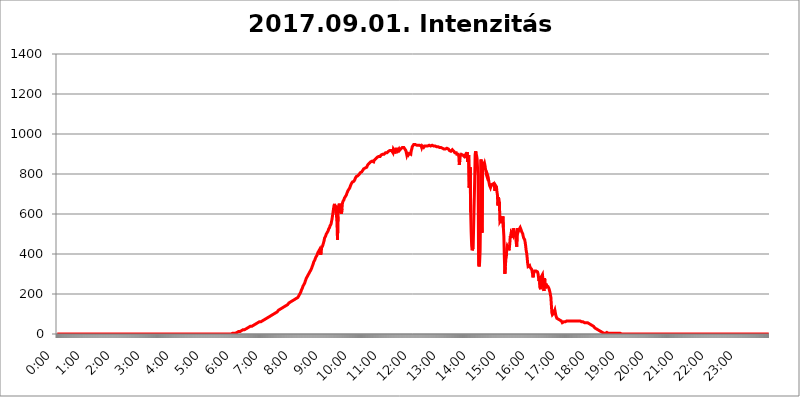
| Category | 2017.09.01. Intenzitás [W/m^2] |
|---|---|
| 0.0 | 0 |
| 0.0006944444444444445 | 0 |
| 0.001388888888888889 | 0 |
| 0.0020833333333333333 | 0 |
| 0.002777777777777778 | 0 |
| 0.003472222222222222 | 0 |
| 0.004166666666666667 | 0 |
| 0.004861111111111111 | 0 |
| 0.005555555555555556 | 0 |
| 0.0062499999999999995 | 0 |
| 0.006944444444444444 | 0 |
| 0.007638888888888889 | 0 |
| 0.008333333333333333 | 0 |
| 0.009027777777777779 | 0 |
| 0.009722222222222222 | 0 |
| 0.010416666666666666 | 0 |
| 0.011111111111111112 | 0 |
| 0.011805555555555555 | 0 |
| 0.012499999999999999 | 0 |
| 0.013194444444444444 | 0 |
| 0.013888888888888888 | 0 |
| 0.014583333333333332 | 0 |
| 0.015277777777777777 | 0 |
| 0.015972222222222224 | 0 |
| 0.016666666666666666 | 0 |
| 0.017361111111111112 | 0 |
| 0.018055555555555557 | 0 |
| 0.01875 | 0 |
| 0.019444444444444445 | 0 |
| 0.02013888888888889 | 0 |
| 0.020833333333333332 | 0 |
| 0.02152777777777778 | 0 |
| 0.022222222222222223 | 0 |
| 0.02291666666666667 | 0 |
| 0.02361111111111111 | 0 |
| 0.024305555555555556 | 0 |
| 0.024999999999999998 | 0 |
| 0.025694444444444447 | 0 |
| 0.02638888888888889 | 0 |
| 0.027083333333333334 | 0 |
| 0.027777777777777776 | 0 |
| 0.02847222222222222 | 0 |
| 0.029166666666666664 | 0 |
| 0.029861111111111113 | 0 |
| 0.030555555555555555 | 0 |
| 0.03125 | 0 |
| 0.03194444444444445 | 0 |
| 0.03263888888888889 | 0 |
| 0.03333333333333333 | 0 |
| 0.034027777777777775 | 0 |
| 0.034722222222222224 | 0 |
| 0.035416666666666666 | 0 |
| 0.036111111111111115 | 0 |
| 0.03680555555555556 | 0 |
| 0.0375 | 0 |
| 0.03819444444444444 | 0 |
| 0.03888888888888889 | 0 |
| 0.03958333333333333 | 0 |
| 0.04027777777777778 | 0 |
| 0.04097222222222222 | 0 |
| 0.041666666666666664 | 0 |
| 0.042361111111111106 | 0 |
| 0.04305555555555556 | 0 |
| 0.043750000000000004 | 0 |
| 0.044444444444444446 | 0 |
| 0.04513888888888889 | 0 |
| 0.04583333333333334 | 0 |
| 0.04652777777777778 | 0 |
| 0.04722222222222222 | 0 |
| 0.04791666666666666 | 0 |
| 0.04861111111111111 | 0 |
| 0.049305555555555554 | 0 |
| 0.049999999999999996 | 0 |
| 0.05069444444444445 | 0 |
| 0.051388888888888894 | 0 |
| 0.052083333333333336 | 0 |
| 0.05277777777777778 | 0 |
| 0.05347222222222222 | 0 |
| 0.05416666666666667 | 0 |
| 0.05486111111111111 | 0 |
| 0.05555555555555555 | 0 |
| 0.05625 | 0 |
| 0.05694444444444444 | 0 |
| 0.057638888888888885 | 0 |
| 0.05833333333333333 | 0 |
| 0.05902777777777778 | 0 |
| 0.059722222222222225 | 0 |
| 0.06041666666666667 | 0 |
| 0.061111111111111116 | 0 |
| 0.06180555555555556 | 0 |
| 0.0625 | 0 |
| 0.06319444444444444 | 0 |
| 0.06388888888888888 | 0 |
| 0.06458333333333334 | 0 |
| 0.06527777777777778 | 0 |
| 0.06597222222222222 | 0 |
| 0.06666666666666667 | 0 |
| 0.06736111111111111 | 0 |
| 0.06805555555555555 | 0 |
| 0.06874999999999999 | 0 |
| 0.06944444444444443 | 0 |
| 0.07013888888888889 | 0 |
| 0.07083333333333333 | 0 |
| 0.07152777777777779 | 0 |
| 0.07222222222222223 | 0 |
| 0.07291666666666667 | 0 |
| 0.07361111111111111 | 0 |
| 0.07430555555555556 | 0 |
| 0.075 | 0 |
| 0.07569444444444444 | 0 |
| 0.0763888888888889 | 0 |
| 0.07708333333333334 | 0 |
| 0.07777777777777778 | 0 |
| 0.07847222222222222 | 0 |
| 0.07916666666666666 | 0 |
| 0.0798611111111111 | 0 |
| 0.08055555555555556 | 0 |
| 0.08125 | 0 |
| 0.08194444444444444 | 0 |
| 0.08263888888888889 | 0 |
| 0.08333333333333333 | 0 |
| 0.08402777777777777 | 0 |
| 0.08472222222222221 | 0 |
| 0.08541666666666665 | 0 |
| 0.08611111111111112 | 0 |
| 0.08680555555555557 | 0 |
| 0.08750000000000001 | 0 |
| 0.08819444444444445 | 0 |
| 0.08888888888888889 | 0 |
| 0.08958333333333333 | 0 |
| 0.09027777777777778 | 0 |
| 0.09097222222222222 | 0 |
| 0.09166666666666667 | 0 |
| 0.09236111111111112 | 0 |
| 0.09305555555555556 | 0 |
| 0.09375 | 0 |
| 0.09444444444444444 | 0 |
| 0.09513888888888888 | 0 |
| 0.09583333333333333 | 0 |
| 0.09652777777777777 | 0 |
| 0.09722222222222222 | 0 |
| 0.09791666666666667 | 0 |
| 0.09861111111111111 | 0 |
| 0.09930555555555555 | 0 |
| 0.09999999999999999 | 0 |
| 0.10069444444444443 | 0 |
| 0.1013888888888889 | 0 |
| 0.10208333333333335 | 0 |
| 0.10277777777777779 | 0 |
| 0.10347222222222223 | 0 |
| 0.10416666666666667 | 0 |
| 0.10486111111111111 | 0 |
| 0.10555555555555556 | 0 |
| 0.10625 | 0 |
| 0.10694444444444444 | 0 |
| 0.1076388888888889 | 0 |
| 0.10833333333333334 | 0 |
| 0.10902777777777778 | 0 |
| 0.10972222222222222 | 0 |
| 0.1111111111111111 | 0 |
| 0.11180555555555556 | 0 |
| 0.11180555555555556 | 0 |
| 0.1125 | 0 |
| 0.11319444444444444 | 0 |
| 0.11388888888888889 | 0 |
| 0.11458333333333333 | 0 |
| 0.11527777777777777 | 0 |
| 0.11597222222222221 | 0 |
| 0.11666666666666665 | 0 |
| 0.1173611111111111 | 0 |
| 0.11805555555555557 | 0 |
| 0.11944444444444445 | 0 |
| 0.12013888888888889 | 0 |
| 0.12083333333333333 | 0 |
| 0.12152777777777778 | 0 |
| 0.12222222222222223 | 0 |
| 0.12291666666666667 | 0 |
| 0.12291666666666667 | 0 |
| 0.12361111111111112 | 0 |
| 0.12430555555555556 | 0 |
| 0.125 | 0 |
| 0.12569444444444444 | 0 |
| 0.12638888888888888 | 0 |
| 0.12708333333333333 | 0 |
| 0.16875 | 0 |
| 0.12847222222222224 | 0 |
| 0.12916666666666668 | 0 |
| 0.12986111111111112 | 0 |
| 0.13055555555555556 | 0 |
| 0.13125 | 0 |
| 0.13194444444444445 | 0 |
| 0.1326388888888889 | 0 |
| 0.13333333333333333 | 0 |
| 0.13402777777777777 | 0 |
| 0.13402777777777777 | 0 |
| 0.13472222222222222 | 0 |
| 0.13541666666666666 | 0 |
| 0.1361111111111111 | 0 |
| 0.13749999999999998 | 0 |
| 0.13819444444444443 | 0 |
| 0.1388888888888889 | 0 |
| 0.13958333333333334 | 0 |
| 0.14027777777777778 | 0 |
| 0.14097222222222222 | 0 |
| 0.14166666666666666 | 0 |
| 0.1423611111111111 | 0 |
| 0.14305555555555557 | 0 |
| 0.14375000000000002 | 0 |
| 0.14444444444444446 | 0 |
| 0.1451388888888889 | 0 |
| 0.1451388888888889 | 0 |
| 0.14652777777777778 | 0 |
| 0.14722222222222223 | 0 |
| 0.14791666666666667 | 0 |
| 0.1486111111111111 | 0 |
| 0.14930555555555555 | 0 |
| 0.15 | 0 |
| 0.15069444444444444 | 0 |
| 0.15138888888888888 | 0 |
| 0.15208333333333332 | 0 |
| 0.15277777777777776 | 0 |
| 0.15347222222222223 | 0 |
| 0.15416666666666667 | 0 |
| 0.15486111111111112 | 0 |
| 0.15555555555555556 | 0 |
| 0.15625 | 0 |
| 0.15694444444444444 | 0 |
| 0.15763888888888888 | 0 |
| 0.15833333333333333 | 0 |
| 0.15902777777777777 | 0 |
| 0.15972222222222224 | 0 |
| 0.16041666666666668 | 0 |
| 0.16111111111111112 | 0 |
| 0.16180555555555556 | 0 |
| 0.1625 | 0 |
| 0.16319444444444445 | 0 |
| 0.1638888888888889 | 0 |
| 0.16458333333333333 | 0 |
| 0.16527777777777777 | 0 |
| 0.16597222222222222 | 0 |
| 0.16666666666666666 | 0 |
| 0.1673611111111111 | 0 |
| 0.16805555555555554 | 0 |
| 0.16874999999999998 | 0 |
| 0.16944444444444443 | 0 |
| 0.17013888888888887 | 0 |
| 0.1708333333333333 | 0 |
| 0.17152777777777775 | 0 |
| 0.17222222222222225 | 0 |
| 0.1729166666666667 | 0 |
| 0.17361111111111113 | 0 |
| 0.17430555555555557 | 0 |
| 0.17500000000000002 | 0 |
| 0.17569444444444446 | 0 |
| 0.1763888888888889 | 0 |
| 0.17708333333333334 | 0 |
| 0.17777777777777778 | 0 |
| 0.17847222222222223 | 0 |
| 0.17916666666666667 | 0 |
| 0.1798611111111111 | 0 |
| 0.18055555555555555 | 0 |
| 0.18125 | 0 |
| 0.18194444444444444 | 0 |
| 0.1826388888888889 | 0 |
| 0.18333333333333335 | 0 |
| 0.1840277777777778 | 0 |
| 0.18472222222222223 | 0 |
| 0.18541666666666667 | 0 |
| 0.18611111111111112 | 0 |
| 0.18680555555555556 | 0 |
| 0.1875 | 0 |
| 0.18819444444444444 | 0 |
| 0.18888888888888888 | 0 |
| 0.18958333333333333 | 0 |
| 0.19027777777777777 | 0 |
| 0.1909722222222222 | 0 |
| 0.19166666666666665 | 0 |
| 0.19236111111111112 | 0 |
| 0.19305555555555554 | 0 |
| 0.19375 | 0 |
| 0.19444444444444445 | 0 |
| 0.1951388888888889 | 0 |
| 0.19583333333333333 | 0 |
| 0.19652777777777777 | 0 |
| 0.19722222222222222 | 0 |
| 0.19791666666666666 | 0 |
| 0.1986111111111111 | 0 |
| 0.19930555555555554 | 0 |
| 0.19999999999999998 | 0 |
| 0.20069444444444443 | 0 |
| 0.20138888888888887 | 0 |
| 0.2020833333333333 | 0 |
| 0.2027777777777778 | 0 |
| 0.2034722222222222 | 0 |
| 0.2041666666666667 | 0 |
| 0.20486111111111113 | 0 |
| 0.20555555555555557 | 0 |
| 0.20625000000000002 | 0 |
| 0.20694444444444446 | 0 |
| 0.2076388888888889 | 0 |
| 0.20833333333333334 | 0 |
| 0.20902777777777778 | 0 |
| 0.20972222222222223 | 0 |
| 0.21041666666666667 | 0 |
| 0.2111111111111111 | 0 |
| 0.21180555555555555 | 0 |
| 0.2125 | 0 |
| 0.21319444444444444 | 0 |
| 0.2138888888888889 | 0 |
| 0.21458333333333335 | 0 |
| 0.2152777777777778 | 0 |
| 0.21597222222222223 | 0 |
| 0.21666666666666667 | 0 |
| 0.21736111111111112 | 0 |
| 0.21805555555555556 | 0 |
| 0.21875 | 0 |
| 0.21944444444444444 | 0 |
| 0.22013888888888888 | 0 |
| 0.22083333333333333 | 0 |
| 0.22152777777777777 | 0 |
| 0.2222222222222222 | 0 |
| 0.22291666666666665 | 0 |
| 0.2236111111111111 | 0 |
| 0.22430555555555556 | 0 |
| 0.225 | 0 |
| 0.22569444444444445 | 0 |
| 0.2263888888888889 | 0 |
| 0.22708333333333333 | 0 |
| 0.22777777777777777 | 0 |
| 0.22847222222222222 | 0 |
| 0.22916666666666666 | 0 |
| 0.2298611111111111 | 0 |
| 0.23055555555555554 | 0 |
| 0.23124999999999998 | 0 |
| 0.23194444444444443 | 0 |
| 0.23263888888888887 | 0 |
| 0.2333333333333333 | 0 |
| 0.2340277777777778 | 0 |
| 0.2347222222222222 | 0 |
| 0.2354166666666667 | 0 |
| 0.23611111111111113 | 0 |
| 0.23680555555555557 | 0 |
| 0.23750000000000002 | 0 |
| 0.23819444444444446 | 0 |
| 0.2388888888888889 | 0 |
| 0.23958333333333334 | 0 |
| 0.24027777777777778 | 0 |
| 0.24097222222222223 | 0 |
| 0.24166666666666667 | 0 |
| 0.2423611111111111 | 0 |
| 0.24305555555555555 | 0 |
| 0.24375 | 0 |
| 0.24444444444444446 | 0 |
| 0.24513888888888888 | 0 |
| 0.24583333333333335 | 3.525 |
| 0.2465277777777778 | 3.525 |
| 0.24722222222222223 | 3.525 |
| 0.24791666666666667 | 3.525 |
| 0.24861111111111112 | 3.525 |
| 0.24930555555555556 | 3.525 |
| 0.25 | 3.525 |
| 0.25069444444444444 | 3.525 |
| 0.2513888888888889 | 7.887 |
| 0.2520833333333333 | 7.887 |
| 0.25277777777777777 | 7.887 |
| 0.2534722222222222 | 7.887 |
| 0.25416666666666665 | 12.257 |
| 0.2548611111111111 | 12.257 |
| 0.2555555555555556 | 12.257 |
| 0.25625000000000003 | 12.257 |
| 0.2569444444444445 | 12.257 |
| 0.2576388888888889 | 12.257 |
| 0.25833333333333336 | 16.636 |
| 0.2590277777777778 | 16.636 |
| 0.25972222222222224 | 16.636 |
| 0.2604166666666667 | 21.024 |
| 0.2611111111111111 | 21.024 |
| 0.26180555555555557 | 21.024 |
| 0.2625 | 21.024 |
| 0.26319444444444445 | 25.419 |
| 0.2638888888888889 | 25.419 |
| 0.26458333333333334 | 25.419 |
| 0.2652777777777778 | 25.419 |
| 0.2659722222222222 | 29.823 |
| 0.26666666666666666 | 29.823 |
| 0.2673611111111111 | 29.823 |
| 0.26805555555555555 | 29.823 |
| 0.26875 | 34.234 |
| 0.26944444444444443 | 34.234 |
| 0.2701388888888889 | 34.234 |
| 0.2708333333333333 | 38.653 |
| 0.27152777777777776 | 38.653 |
| 0.2722222222222222 | 38.653 |
| 0.27291666666666664 | 38.653 |
| 0.2736111111111111 | 38.653 |
| 0.2743055555555555 | 43.079 |
| 0.27499999999999997 | 43.079 |
| 0.27569444444444446 | 43.079 |
| 0.27638888888888885 | 47.511 |
| 0.27708333333333335 | 47.511 |
| 0.2777777777777778 | 47.511 |
| 0.27847222222222223 | 47.511 |
| 0.2791666666666667 | 51.951 |
| 0.2798611111111111 | 51.951 |
| 0.28055555555555556 | 51.951 |
| 0.28125 | 56.398 |
| 0.28194444444444444 | 56.398 |
| 0.2826388888888889 | 56.398 |
| 0.2833333333333333 | 60.85 |
| 0.28402777777777777 | 60.85 |
| 0.2847222222222222 | 60.85 |
| 0.28541666666666665 | 60.85 |
| 0.28611111111111115 | 65.31 |
| 0.28680555555555554 | 65.31 |
| 0.28750000000000003 | 65.31 |
| 0.2881944444444445 | 69.775 |
| 0.2888888888888889 | 69.775 |
| 0.28958333333333336 | 69.775 |
| 0.2902777777777778 | 74.246 |
| 0.29097222222222224 | 74.246 |
| 0.2916666666666667 | 74.246 |
| 0.2923611111111111 | 78.722 |
| 0.29305555555555557 | 78.722 |
| 0.29375 | 78.722 |
| 0.29444444444444445 | 83.205 |
| 0.2951388888888889 | 83.205 |
| 0.29583333333333334 | 83.205 |
| 0.2965277777777778 | 87.692 |
| 0.2972222222222222 | 87.692 |
| 0.29791666666666666 | 87.692 |
| 0.2986111111111111 | 92.184 |
| 0.29930555555555555 | 92.184 |
| 0.3 | 92.184 |
| 0.30069444444444443 | 96.682 |
| 0.3013888888888889 | 96.682 |
| 0.3020833333333333 | 96.682 |
| 0.30277777777777776 | 101.184 |
| 0.3034722222222222 | 101.184 |
| 0.30416666666666664 | 101.184 |
| 0.3048611111111111 | 105.69 |
| 0.3055555555555555 | 105.69 |
| 0.30624999999999997 | 105.69 |
| 0.3069444444444444 | 110.201 |
| 0.3076388888888889 | 110.201 |
| 0.30833333333333335 | 110.201 |
| 0.3090277777777778 | 114.716 |
| 0.30972222222222223 | 114.716 |
| 0.3104166666666667 | 119.235 |
| 0.3111111111111111 | 119.235 |
| 0.31180555555555556 | 119.235 |
| 0.3125 | 123.758 |
| 0.31319444444444444 | 123.758 |
| 0.3138888888888889 | 123.758 |
| 0.3145833333333333 | 128.284 |
| 0.31527777777777777 | 128.284 |
| 0.3159722222222222 | 128.284 |
| 0.31666666666666665 | 132.814 |
| 0.31736111111111115 | 132.814 |
| 0.31805555555555554 | 137.347 |
| 0.31875000000000003 | 137.347 |
| 0.3194444444444445 | 137.347 |
| 0.3201388888888889 | 141.884 |
| 0.32083333333333336 | 141.884 |
| 0.3215277777777778 | 146.423 |
| 0.32222222222222224 | 146.423 |
| 0.3229166666666667 | 146.423 |
| 0.3236111111111111 | 150.964 |
| 0.32430555555555557 | 150.964 |
| 0.325 | 155.509 |
| 0.32569444444444445 | 155.509 |
| 0.3263888888888889 | 155.509 |
| 0.32708333333333334 | 160.056 |
| 0.3277777777777778 | 160.056 |
| 0.3284722222222222 | 160.056 |
| 0.32916666666666666 | 164.605 |
| 0.3298611111111111 | 164.605 |
| 0.33055555555555555 | 169.156 |
| 0.33125 | 169.156 |
| 0.33194444444444443 | 169.156 |
| 0.3326388888888889 | 173.709 |
| 0.3333333333333333 | 173.709 |
| 0.3340277777777778 | 173.709 |
| 0.3347222222222222 | 178.264 |
| 0.3354166666666667 | 178.264 |
| 0.3361111111111111 | 182.82 |
| 0.3368055555555556 | 182.82 |
| 0.33749999999999997 | 182.82 |
| 0.33819444444444446 | 187.378 |
| 0.33888888888888885 | 191.937 |
| 0.33958333333333335 | 196.497 |
| 0.34027777777777773 | 201.058 |
| 0.34097222222222223 | 205.62 |
| 0.3416666666666666 | 210.182 |
| 0.3423611111111111 | 219.309 |
| 0.3430555555555555 | 223.873 |
| 0.34375 | 228.436 |
| 0.3444444444444445 | 237.564 |
| 0.3451388888888889 | 242.127 |
| 0.3458333333333334 | 246.689 |
| 0.34652777777777777 | 251.251 |
| 0.34722222222222227 | 255.813 |
| 0.34791666666666665 | 264.932 |
| 0.34861111111111115 | 269.49 |
| 0.34930555555555554 | 278.603 |
| 0.35000000000000003 | 283.156 |
| 0.3506944444444444 | 287.709 |
| 0.3513888888888889 | 292.259 |
| 0.3520833333333333 | 296.808 |
| 0.3527777777777778 | 301.354 |
| 0.3534722222222222 | 305.898 |
| 0.3541666666666667 | 310.44 |
| 0.3548611111111111 | 314.98 |
| 0.35555555555555557 | 319.517 |
| 0.35625 | 324.052 |
| 0.35694444444444445 | 328.584 |
| 0.3576388888888889 | 337.639 |
| 0.35833333333333334 | 342.162 |
| 0.3590277777777778 | 351.198 |
| 0.3597222222222222 | 360.221 |
| 0.36041666666666666 | 364.728 |
| 0.3611111111111111 | 369.23 |
| 0.36180555555555555 | 373.729 |
| 0.3625 | 382.715 |
| 0.36319444444444443 | 387.202 |
| 0.3638888888888889 | 387.202 |
| 0.3645833333333333 | 396.164 |
| 0.3652777777777778 | 405.108 |
| 0.3659722222222222 | 405.108 |
| 0.3666666666666667 | 414.035 |
| 0.3673611111111111 | 414.035 |
| 0.3680555555555556 | 422.943 |
| 0.36874999999999997 | 427.39 |
| 0.36944444444444446 | 396.164 |
| 0.37013888888888885 | 409.574 |
| 0.37083333333333335 | 431.833 |
| 0.37152777777777773 | 427.39 |
| 0.37222222222222223 | 440.702 |
| 0.3729166666666666 | 440.702 |
| 0.3736111111111111 | 458.38 |
| 0.3743055555555555 | 467.187 |
| 0.375 | 480.356 |
| 0.3756944444444445 | 484.735 |
| 0.3763888888888889 | 489.108 |
| 0.3770833333333334 | 497.836 |
| 0.37777777777777777 | 502.192 |
| 0.37847222222222227 | 506.542 |
| 0.37916666666666665 | 510.885 |
| 0.37986111111111115 | 515.223 |
| 0.38055555555555554 | 523.88 |
| 0.38125000000000003 | 528.2 |
| 0.3819444444444444 | 532.513 |
| 0.3826388888888889 | 541.121 |
| 0.3833333333333333 | 545.416 |
| 0.3840277777777778 | 549.704 |
| 0.3847222222222222 | 562.53 |
| 0.3854166666666667 | 575.299 |
| 0.3861111111111111 | 592.233 |
| 0.38680555555555557 | 609.062 |
| 0.3875 | 625.784 |
| 0.38819444444444445 | 642.4 |
| 0.3888888888888889 | 650.667 |
| 0.38958333333333334 | 634.105 |
| 0.3902777777777778 | 642.4 |
| 0.3909722222222222 | 604.864 |
| 0.39166666666666666 | 592.233 |
| 0.3923611111111111 | 553.986 |
| 0.39305555555555555 | 471.582 |
| 0.39375 | 588.009 |
| 0.39444444444444443 | 638.256 |
| 0.3951388888888889 | 646.537 |
| 0.3958333333333333 | 642.4 |
| 0.3965277777777778 | 646.537 |
| 0.3972222222222222 | 646.537 |
| 0.3979166666666667 | 642.4 |
| 0.3986111111111111 | 600.661 |
| 0.3993055555555556 | 625.784 |
| 0.39999999999999997 | 654.791 |
| 0.40069444444444446 | 663.019 |
| 0.40138888888888885 | 663.019 |
| 0.40208333333333335 | 671.22 |
| 0.40277777777777773 | 679.395 |
| 0.40347222222222223 | 683.473 |
| 0.4041666666666666 | 687.544 |
| 0.4048611111111111 | 691.608 |
| 0.4055555555555555 | 695.666 |
| 0.40625 | 703.762 |
| 0.4069444444444445 | 707.8 |
| 0.4076388888888889 | 715.858 |
| 0.4083333333333334 | 719.877 |
| 0.40902777777777777 | 723.889 |
| 0.40972222222222227 | 727.896 |
| 0.41041666666666665 | 731.896 |
| 0.41111111111111115 | 739.877 |
| 0.41180555555555554 | 743.859 |
| 0.41250000000000003 | 751.803 |
| 0.4131944444444444 | 755.766 |
| 0.4138888888888889 | 759.723 |
| 0.4145833333333333 | 763.674 |
| 0.4152777777777778 | 763.674 |
| 0.4159722222222222 | 763.674 |
| 0.4166666666666667 | 767.62 |
| 0.4173611111111111 | 771.559 |
| 0.41805555555555557 | 779.42 |
| 0.41875 | 783.342 |
| 0.41944444444444445 | 787.258 |
| 0.4201388888888889 | 787.258 |
| 0.42083333333333334 | 791.169 |
| 0.4215277777777778 | 791.169 |
| 0.4222222222222222 | 795.074 |
| 0.42291666666666666 | 795.074 |
| 0.4236111111111111 | 798.974 |
| 0.42430555555555555 | 798.974 |
| 0.425 | 806.757 |
| 0.42569444444444443 | 810.641 |
| 0.4263888888888889 | 810.641 |
| 0.4270833333333333 | 810.641 |
| 0.4277777777777778 | 814.519 |
| 0.4284722222222222 | 818.392 |
| 0.4291666666666667 | 822.26 |
| 0.4298611111111111 | 826.123 |
| 0.4305555555555556 | 829.981 |
| 0.43124999999999997 | 829.981 |
| 0.43194444444444446 | 829.981 |
| 0.43263888888888885 | 829.981 |
| 0.43333333333333335 | 833.834 |
| 0.43402777777777773 | 833.834 |
| 0.43472222222222223 | 837.682 |
| 0.4354166666666666 | 845.365 |
| 0.4361111111111111 | 845.365 |
| 0.4368055555555555 | 849.199 |
| 0.4375 | 853.029 |
| 0.4381944444444445 | 853.029 |
| 0.4388888888888889 | 856.855 |
| 0.4395833333333334 | 860.676 |
| 0.44027777777777777 | 864.493 |
| 0.44097222222222227 | 864.493 |
| 0.44166666666666665 | 864.493 |
| 0.44236111111111115 | 860.676 |
| 0.44305555555555554 | 860.676 |
| 0.44375000000000003 | 860.676 |
| 0.4444444444444444 | 868.305 |
| 0.4451388888888889 | 872.114 |
| 0.4458333333333333 | 872.114 |
| 0.4465277777777778 | 875.918 |
| 0.4472222222222222 | 875.918 |
| 0.4479166666666667 | 879.719 |
| 0.4486111111111111 | 883.516 |
| 0.44930555555555557 | 883.516 |
| 0.45 | 887.309 |
| 0.45069444444444445 | 887.309 |
| 0.4513888888888889 | 891.099 |
| 0.45208333333333334 | 891.099 |
| 0.4527777777777778 | 887.309 |
| 0.4534722222222222 | 891.099 |
| 0.45416666666666666 | 894.885 |
| 0.4548611111111111 | 891.099 |
| 0.45555555555555555 | 898.668 |
| 0.45625 | 898.668 |
| 0.45694444444444443 | 894.885 |
| 0.4576388888888889 | 898.668 |
| 0.4583333333333333 | 898.668 |
| 0.4590277777777778 | 902.447 |
| 0.4597222222222222 | 902.447 |
| 0.4604166666666667 | 906.223 |
| 0.4611111111111111 | 902.447 |
| 0.4618055555555556 | 906.223 |
| 0.46249999999999997 | 906.223 |
| 0.46319444444444446 | 906.223 |
| 0.46388888888888885 | 909.996 |
| 0.46458333333333335 | 913.766 |
| 0.46527777777777773 | 917.534 |
| 0.46597222222222223 | 917.534 |
| 0.4666666666666666 | 917.534 |
| 0.4673611111111111 | 917.534 |
| 0.4680555555555555 | 917.534 |
| 0.46875 | 917.534 |
| 0.4694444444444445 | 917.534 |
| 0.4701388888888889 | 917.534 |
| 0.4708333333333334 | 906.223 |
| 0.47152777777777777 | 925.06 |
| 0.47222222222222227 | 925.06 |
| 0.47291666666666665 | 917.534 |
| 0.47361111111111115 | 902.447 |
| 0.47430555555555554 | 906.223 |
| 0.47500000000000003 | 925.06 |
| 0.4756944444444444 | 925.06 |
| 0.4763888888888889 | 928.819 |
| 0.4770833333333333 | 925.06 |
| 0.4777777777777778 | 917.534 |
| 0.4784722222222222 | 921.298 |
| 0.4791666666666667 | 925.06 |
| 0.4798611111111111 | 917.534 |
| 0.48055555555555557 | 917.534 |
| 0.48125 | 921.298 |
| 0.48194444444444445 | 925.06 |
| 0.4826388888888889 | 925.06 |
| 0.48333333333333334 | 928.819 |
| 0.4840277777777778 | 932.576 |
| 0.4847222222222222 | 932.576 |
| 0.48541666666666666 | 936.33 |
| 0.4861111111111111 | 932.576 |
| 0.48680555555555555 | 928.819 |
| 0.4875 | 925.06 |
| 0.48819444444444443 | 925.06 |
| 0.4888888888888889 | 917.534 |
| 0.4895833333333333 | 921.298 |
| 0.4902777777777778 | 894.885 |
| 0.4909722222222222 | 902.447 |
| 0.4916666666666667 | 902.447 |
| 0.4923611111111111 | 894.885 |
| 0.4930555555555556 | 891.099 |
| 0.49374999999999997 | 902.447 |
| 0.49444444444444446 | 898.668 |
| 0.49513888888888885 | 902.447 |
| 0.49583333333333335 | 898.668 |
| 0.49652777777777773 | 917.534 |
| 0.49722222222222223 | 925.06 |
| 0.4979166666666666 | 936.33 |
| 0.4986111111111111 | 940.082 |
| 0.4993055555555555 | 940.082 |
| 0.5 | 947.58 |
| 0.5006944444444444 | 947.58 |
| 0.5013888888888889 | 943.832 |
| 0.5020833333333333 | 947.58 |
| 0.5027777777777778 | 943.832 |
| 0.5034722222222222 | 943.832 |
| 0.5041666666666667 | 943.832 |
| 0.5048611111111111 | 940.082 |
| 0.5055555555555555 | 940.082 |
| 0.50625 | 943.832 |
| 0.5069444444444444 | 940.082 |
| 0.5076388888888889 | 943.832 |
| 0.5083333333333333 | 943.832 |
| 0.5090277777777777 | 943.832 |
| 0.5097222222222222 | 943.832 |
| 0.5104166666666666 | 940.082 |
| 0.5111111111111112 | 932.576 |
| 0.5118055555555555 | 940.082 |
| 0.5125000000000001 | 940.082 |
| 0.5131944444444444 | 940.082 |
| 0.513888888888889 | 932.576 |
| 0.5145833333333333 | 936.33 |
| 0.5152777777777778 | 940.082 |
| 0.5159722222222222 | 943.832 |
| 0.5166666666666667 | 940.082 |
| 0.517361111111111 | 940.082 |
| 0.5180555555555556 | 940.082 |
| 0.5187499999999999 | 940.082 |
| 0.5194444444444445 | 940.082 |
| 0.5201388888888888 | 936.33 |
| 0.5208333333333334 | 936.33 |
| 0.5215277777777778 | 943.832 |
| 0.5222222222222223 | 943.832 |
| 0.5229166666666667 | 940.082 |
| 0.5236111111111111 | 940.082 |
| 0.5243055555555556 | 940.082 |
| 0.525 | 943.832 |
| 0.5256944444444445 | 943.832 |
| 0.5263888888888889 | 943.832 |
| 0.5270833333333333 | 940.082 |
| 0.5277777777777778 | 940.082 |
| 0.5284722222222222 | 940.082 |
| 0.5291666666666667 | 940.082 |
| 0.5298611111111111 | 940.082 |
| 0.5305555555555556 | 936.33 |
| 0.53125 | 936.33 |
| 0.5319444444444444 | 936.33 |
| 0.5326388888888889 | 936.33 |
| 0.5333333333333333 | 936.33 |
| 0.5340277777777778 | 936.33 |
| 0.5347222222222222 | 936.33 |
| 0.5354166666666667 | 936.33 |
| 0.5361111111111111 | 932.576 |
| 0.5368055555555555 | 932.576 |
| 0.5375 | 932.576 |
| 0.5381944444444444 | 932.576 |
| 0.5388888888888889 | 932.576 |
| 0.5395833333333333 | 928.819 |
| 0.5402777777777777 | 928.819 |
| 0.5409722222222222 | 928.819 |
| 0.5416666666666666 | 928.819 |
| 0.5423611111111112 | 925.06 |
| 0.5430555555555555 | 925.06 |
| 0.5437500000000001 | 925.06 |
| 0.5444444444444444 | 925.06 |
| 0.545138888888889 | 928.819 |
| 0.5458333333333333 | 928.819 |
| 0.5465277777777778 | 928.819 |
| 0.5472222222222222 | 928.819 |
| 0.5479166666666667 | 925.06 |
| 0.548611111111111 | 925.06 |
| 0.5493055555555556 | 921.298 |
| 0.5499999999999999 | 917.534 |
| 0.5506944444444445 | 917.534 |
| 0.5513888888888888 | 913.766 |
| 0.5520833333333334 | 913.766 |
| 0.5527777777777778 | 913.766 |
| 0.5534722222222223 | 917.534 |
| 0.5541666666666667 | 921.298 |
| 0.5548611111111111 | 921.298 |
| 0.5555555555555556 | 917.534 |
| 0.55625 | 913.766 |
| 0.5569444444444445 | 909.996 |
| 0.5576388888888889 | 906.223 |
| 0.5583333333333333 | 902.447 |
| 0.5590277777777778 | 906.223 |
| 0.5597222222222222 | 906.223 |
| 0.5604166666666667 | 898.668 |
| 0.5611111111111111 | 898.668 |
| 0.5618055555555556 | 902.447 |
| 0.5625 | 898.668 |
| 0.5631944444444444 | 891.099 |
| 0.5638888888888889 | 845.365 |
| 0.5645833333333333 | 868.305 |
| 0.5652777777777778 | 891.099 |
| 0.5659722222222222 | 894.885 |
| 0.5666666666666667 | 898.668 |
| 0.5673611111111111 | 898.668 |
| 0.5680555555555555 | 898.668 |
| 0.56875 | 894.885 |
| 0.5694444444444444 | 894.885 |
| 0.5701388888888889 | 894.885 |
| 0.5708333333333333 | 887.309 |
| 0.5715277777777777 | 887.309 |
| 0.5722222222222222 | 894.885 |
| 0.5729166666666666 | 891.099 |
| 0.5736111111111112 | 879.719 |
| 0.5743055555555555 | 898.668 |
| 0.5750000000000001 | 909.996 |
| 0.5756944444444444 | 860.676 |
| 0.576388888888889 | 879.719 |
| 0.5770833333333333 | 894.885 |
| 0.5777777777777778 | 731.896 |
| 0.5784722222222222 | 751.803 |
| 0.5791666666666667 | 833.834 |
| 0.579861111111111 | 609.062 |
| 0.5805555555555556 | 506.542 |
| 0.5812499999999999 | 440.702 |
| 0.5819444444444445 | 418.492 |
| 0.5826388888888888 | 422.943 |
| 0.5833333333333334 | 431.833 |
| 0.5840277777777778 | 431.833 |
| 0.5847222222222223 | 427.39 |
| 0.5854166666666667 | 759.723 |
| 0.5861111111111111 | 898.668 |
| 0.5868055555555556 | 913.766 |
| 0.5875 | 902.447 |
| 0.5881944444444445 | 891.099 |
| 0.5888888888888889 | 875.918 |
| 0.5895833333333333 | 818.392 |
| 0.5902777777777778 | 791.169 |
| 0.5909722222222222 | 346.682 |
| 0.5916666666666667 | 337.639 |
| 0.5923611111111111 | 355.712 |
| 0.5930555555555556 | 414.035 |
| 0.59375 | 613.252 |
| 0.5944444444444444 | 872.114 |
| 0.5951388888888889 | 545.416 |
| 0.5958333333333333 | 506.542 |
| 0.5965277777777778 | 798.974 |
| 0.5972222222222222 | 860.676 |
| 0.5979166666666667 | 853.029 |
| 0.5986111111111111 | 845.365 |
| 0.5993055555555555 | 853.029 |
| 0.6 | 841.526 |
| 0.6006944444444444 | 822.26 |
| 0.6013888888888889 | 814.519 |
| 0.6020833333333333 | 795.074 |
| 0.6027777777777777 | 787.258 |
| 0.6034722222222222 | 795.074 |
| 0.6041666666666666 | 787.258 |
| 0.6048611111111112 | 787.258 |
| 0.6055555555555555 | 783.342 |
| 0.6062500000000001 | 743.859 |
| 0.6069444444444444 | 747.834 |
| 0.607638888888889 | 731.896 |
| 0.6083333333333333 | 739.877 |
| 0.6090277777777778 | 743.859 |
| 0.6097222222222222 | 747.834 |
| 0.6104166666666667 | 751.803 |
| 0.611111111111111 | 743.859 |
| 0.6118055555555556 | 751.803 |
| 0.6124999999999999 | 751.803 |
| 0.6131944444444445 | 735.89 |
| 0.6138888888888888 | 715.858 |
| 0.6145833333333334 | 743.859 |
| 0.6152777777777778 | 743.859 |
| 0.6159722222222223 | 735.89 |
| 0.6166666666666667 | 711.832 |
| 0.6173611111111111 | 695.666 |
| 0.6180555555555556 | 642.4 |
| 0.61875 | 683.473 |
| 0.6194444444444445 | 671.22 |
| 0.6201388888888889 | 658.909 |
| 0.6208333333333333 | 562.53 |
| 0.6215277777777778 | 558.261 |
| 0.6222222222222222 | 571.049 |
| 0.6229166666666667 | 553.986 |
| 0.6236111111111111 | 558.261 |
| 0.6243055555555556 | 571.049 |
| 0.625 | 588.009 |
| 0.6256944444444444 | 532.513 |
| 0.6263888888888889 | 489.108 |
| 0.6270833333333333 | 382.715 |
| 0.6277777777777778 | 301.354 |
| 0.6284722222222222 | 337.639 |
| 0.6291666666666667 | 373.729 |
| 0.6298611111111111 | 387.202 |
| 0.6305555555555555 | 427.39 |
| 0.63125 | 440.702 |
| 0.6319444444444444 | 436.27 |
| 0.6326388888888889 | 431.833 |
| 0.6333333333333333 | 418.492 |
| 0.6340277777777777 | 427.39 |
| 0.6347222222222222 | 453.968 |
| 0.6354166666666666 | 489.108 |
| 0.6361111111111112 | 480.356 |
| 0.6368055555555555 | 506.542 |
| 0.6375000000000001 | 510.885 |
| 0.6381944444444444 | 506.542 |
| 0.638888888888889 | 493.475 |
| 0.6395833333333333 | 528.2 |
| 0.6402777777777778 | 519.555 |
| 0.6409722222222222 | 515.223 |
| 0.6416666666666667 | 506.542 |
| 0.642361111111111 | 510.885 |
| 0.6430555555555556 | 480.356 |
| 0.6437499999999999 | 458.38 |
| 0.6444444444444445 | 436.27 |
| 0.6451388888888888 | 528.2 |
| 0.6458333333333334 | 532.513 |
| 0.6465277777777778 | 510.885 |
| 0.6472222222222223 | 510.885 |
| 0.6479166666666667 | 523.88 |
| 0.6486111111111111 | 523.88 |
| 0.6493055555555556 | 532.513 |
| 0.65 | 528.2 |
| 0.6506944444444445 | 519.555 |
| 0.6513888888888889 | 510.885 |
| 0.6520833333333333 | 506.542 |
| 0.6527777777777778 | 502.192 |
| 0.6534722222222222 | 489.108 |
| 0.6541666666666667 | 480.356 |
| 0.6548611111111111 | 480.356 |
| 0.6555555555555556 | 471.582 |
| 0.65625 | 458.38 |
| 0.6569444444444444 | 440.702 |
| 0.6576388888888889 | 418.492 |
| 0.6583333333333333 | 405.108 |
| 0.6590277777777778 | 382.715 |
| 0.6597222222222222 | 355.712 |
| 0.6604166666666667 | 337.639 |
| 0.6611111111111111 | 337.639 |
| 0.6618055555555555 | 342.162 |
| 0.6625 | 342.162 |
| 0.6631944444444444 | 333.113 |
| 0.6638888888888889 | 333.113 |
| 0.6645833333333333 | 333.113 |
| 0.6652777777777777 | 324.052 |
| 0.6659722222222222 | 314.98 |
| 0.6666666666666666 | 310.44 |
| 0.6673611111111111 | 283.156 |
| 0.6680555555555556 | 301.354 |
| 0.6687500000000001 | 305.898 |
| 0.6694444444444444 | 314.98 |
| 0.6701388888888888 | 319.517 |
| 0.6708333333333334 | 314.98 |
| 0.6715277777777778 | 314.98 |
| 0.6722222222222222 | 310.44 |
| 0.6729166666666666 | 314.98 |
| 0.6736111111111112 | 310.44 |
| 0.6743055555555556 | 301.354 |
| 0.6749999999999999 | 301.354 |
| 0.6756944444444444 | 264.932 |
| 0.6763888888888889 | 287.709 |
| 0.6770833333333334 | 233 |
| 0.6777777777777777 | 223.873 |
| 0.6784722222222223 | 260.373 |
| 0.6791666666666667 | 287.709 |
| 0.6798611111111111 | 287.709 |
| 0.6805555555555555 | 296.808 |
| 0.68125 | 292.259 |
| 0.6819444444444445 | 296.808 |
| 0.6826388888888889 | 214.746 |
| 0.6833333333333332 | 278.603 |
| 0.6840277777777778 | 269.49 |
| 0.6847222222222222 | 228.436 |
| 0.6854166666666667 | 251.251 |
| 0.686111111111111 | 242.127 |
| 0.6868055555555556 | 242.127 |
| 0.6875 | 237.564 |
| 0.6881944444444444 | 237.564 |
| 0.688888888888889 | 233 |
| 0.6895833333333333 | 228.436 |
| 0.6902777777777778 | 223.873 |
| 0.6909722222222222 | 210.182 |
| 0.6916666666666668 | 196.497 |
| 0.6923611111111111 | 182.82 |
| 0.6930555555555555 | 141.884 |
| 0.69375 | 105.69 |
| 0.6944444444444445 | 96.682 |
| 0.6951388888888889 | 92.184 |
| 0.6958333333333333 | 96.682 |
| 0.6965277777777777 | 105.69 |
| 0.6972222222222223 | 105.69 |
| 0.6979166666666666 | 119.235 |
| 0.6986111111111111 | 123.758 |
| 0.6993055555555556 | 92.184 |
| 0.7000000000000001 | 87.692 |
| 0.7006944444444444 | 78.722 |
| 0.7013888888888888 | 78.722 |
| 0.7020833333333334 | 78.722 |
| 0.7027777777777778 | 74.246 |
| 0.7034722222222222 | 74.246 |
| 0.7041666666666666 | 74.246 |
| 0.7048611111111112 | 69.775 |
| 0.7055555555555556 | 69.775 |
| 0.7062499999999999 | 69.775 |
| 0.7069444444444444 | 65.31 |
| 0.7076388888888889 | 60.85 |
| 0.7083333333333334 | 56.398 |
| 0.7090277777777777 | 56.398 |
| 0.7097222222222223 | 56.398 |
| 0.7104166666666667 | 60.85 |
| 0.7111111111111111 | 60.85 |
| 0.7118055555555555 | 60.85 |
| 0.7125 | 60.85 |
| 0.7131944444444445 | 60.85 |
| 0.7138888888888889 | 65.31 |
| 0.7145833333333332 | 65.31 |
| 0.7152777777777778 | 65.31 |
| 0.7159722222222222 | 65.31 |
| 0.7166666666666667 | 65.31 |
| 0.717361111111111 | 65.31 |
| 0.7180555555555556 | 65.31 |
| 0.71875 | 65.31 |
| 0.7194444444444444 | 65.31 |
| 0.720138888888889 | 65.31 |
| 0.7208333333333333 | 65.31 |
| 0.7215277777777778 | 65.31 |
| 0.7222222222222222 | 65.31 |
| 0.7229166666666668 | 65.31 |
| 0.7236111111111111 | 65.31 |
| 0.7243055555555555 | 65.31 |
| 0.725 | 65.31 |
| 0.7256944444444445 | 65.31 |
| 0.7263888888888889 | 65.31 |
| 0.7270833333333333 | 65.31 |
| 0.7277777777777777 | 65.31 |
| 0.7284722222222223 | 65.31 |
| 0.7291666666666666 | 65.31 |
| 0.7298611111111111 | 65.31 |
| 0.7305555555555556 | 65.31 |
| 0.7312500000000001 | 65.31 |
| 0.7319444444444444 | 65.31 |
| 0.7326388888888888 | 65.31 |
| 0.7333333333333334 | 65.31 |
| 0.7340277777777778 | 60.85 |
| 0.7347222222222222 | 60.85 |
| 0.7354166666666666 | 60.85 |
| 0.7361111111111112 | 60.85 |
| 0.7368055555555556 | 60.85 |
| 0.7374999999999999 | 60.85 |
| 0.7381944444444444 | 56.398 |
| 0.7388888888888889 | 56.398 |
| 0.7395833333333334 | 56.398 |
| 0.7402777777777777 | 56.398 |
| 0.7409722222222223 | 56.398 |
| 0.7416666666666667 | 56.398 |
| 0.7423611111111111 | 51.951 |
| 0.7430555555555555 | 56.398 |
| 0.74375 | 56.398 |
| 0.7444444444444445 | 51.951 |
| 0.7451388888888889 | 51.951 |
| 0.7458333333333332 | 51.951 |
| 0.7465277777777778 | 51.951 |
| 0.7472222222222222 | 51.951 |
| 0.7479166666666667 | 47.511 |
| 0.748611111111111 | 47.511 |
| 0.7493055555555556 | 43.079 |
| 0.75 | 43.079 |
| 0.7506944444444444 | 38.653 |
| 0.751388888888889 | 38.653 |
| 0.7520833333333333 | 38.653 |
| 0.7527777777777778 | 34.234 |
| 0.7534722222222222 | 34.234 |
| 0.7541666666666668 | 29.823 |
| 0.7548611111111111 | 29.823 |
| 0.7555555555555555 | 29.823 |
| 0.75625 | 25.419 |
| 0.7569444444444445 | 25.419 |
| 0.7576388888888889 | 25.419 |
| 0.7583333333333333 | 21.024 |
| 0.7590277777777777 | 21.024 |
| 0.7597222222222223 | 16.636 |
| 0.7604166666666666 | 16.636 |
| 0.7611111111111111 | 12.257 |
| 0.7618055555555556 | 12.257 |
| 0.7625000000000001 | 12.257 |
| 0.7631944444444444 | 7.887 |
| 0.7638888888888888 | 7.887 |
| 0.7645833333333334 | 7.887 |
| 0.7652777777777778 | 3.525 |
| 0.7659722222222222 | 3.525 |
| 0.7666666666666666 | 3.525 |
| 0.7673611111111112 | 3.525 |
| 0.7680555555555556 | 3.525 |
| 0.7687499999999999 | 3.525 |
| 0.7694444444444444 | 3.525 |
| 0.7701388888888889 | 7.887 |
| 0.7708333333333334 | 7.887 |
| 0.7715277777777777 | 7.887 |
| 0.7722222222222223 | 7.887 |
| 0.7729166666666667 | 3.525 |
| 0.7736111111111111 | 3.525 |
| 0.7743055555555555 | 3.525 |
| 0.775 | 3.525 |
| 0.7756944444444445 | 3.525 |
| 0.7763888888888889 | 3.525 |
| 0.7770833333333332 | 3.525 |
| 0.7777777777777778 | 3.525 |
| 0.7784722222222222 | 3.525 |
| 0.7791666666666667 | 3.525 |
| 0.779861111111111 | 3.525 |
| 0.7805555555555556 | 3.525 |
| 0.78125 | 3.525 |
| 0.7819444444444444 | 3.525 |
| 0.782638888888889 | 3.525 |
| 0.7833333333333333 | 3.525 |
| 0.7840277777777778 | 3.525 |
| 0.7847222222222222 | 3.525 |
| 0.7854166666666668 | 3.525 |
| 0.7861111111111111 | 3.525 |
| 0.7868055555555555 | 3.525 |
| 0.7875 | 3.525 |
| 0.7881944444444445 | 3.525 |
| 0.7888888888888889 | 3.525 |
| 0.7895833333333333 | 3.525 |
| 0.7902777777777777 | 0 |
| 0.7909722222222223 | 3.525 |
| 0.7916666666666666 | 0 |
| 0.7923611111111111 | 0 |
| 0.7930555555555556 | 0 |
| 0.7937500000000001 | 0 |
| 0.7944444444444444 | 0 |
| 0.7951388888888888 | 0 |
| 0.7958333333333334 | 0 |
| 0.7965277777777778 | 0 |
| 0.7972222222222222 | 0 |
| 0.7979166666666666 | 0 |
| 0.7986111111111112 | 0 |
| 0.7993055555555556 | 0 |
| 0.7999999999999999 | 0 |
| 0.8006944444444444 | 0 |
| 0.8013888888888889 | 0 |
| 0.8020833333333334 | 0 |
| 0.8027777777777777 | 0 |
| 0.8034722222222223 | 0 |
| 0.8041666666666667 | 0 |
| 0.8048611111111111 | 0 |
| 0.8055555555555555 | 0 |
| 0.80625 | 0 |
| 0.8069444444444445 | 0 |
| 0.8076388888888889 | 0 |
| 0.8083333333333332 | 0 |
| 0.8090277777777778 | 0 |
| 0.8097222222222222 | 0 |
| 0.8104166666666667 | 0 |
| 0.811111111111111 | 0 |
| 0.8118055555555556 | 0 |
| 0.8125 | 0 |
| 0.8131944444444444 | 0 |
| 0.813888888888889 | 0 |
| 0.8145833333333333 | 0 |
| 0.8152777777777778 | 0 |
| 0.8159722222222222 | 0 |
| 0.8166666666666668 | 0 |
| 0.8173611111111111 | 0 |
| 0.8180555555555555 | 0 |
| 0.81875 | 0 |
| 0.8194444444444445 | 0 |
| 0.8201388888888889 | 0 |
| 0.8208333333333333 | 0 |
| 0.8215277777777777 | 0 |
| 0.8222222222222223 | 0 |
| 0.8229166666666666 | 0 |
| 0.8236111111111111 | 0 |
| 0.8243055555555556 | 0 |
| 0.8250000000000001 | 0 |
| 0.8256944444444444 | 0 |
| 0.8263888888888888 | 0 |
| 0.8270833333333334 | 0 |
| 0.8277777777777778 | 0 |
| 0.8284722222222222 | 0 |
| 0.8291666666666666 | 0 |
| 0.8298611111111112 | 0 |
| 0.8305555555555556 | 0 |
| 0.8312499999999999 | 0 |
| 0.8319444444444444 | 0 |
| 0.8326388888888889 | 0 |
| 0.8333333333333334 | 0 |
| 0.8340277777777777 | 0 |
| 0.8347222222222223 | 0 |
| 0.8354166666666667 | 0 |
| 0.8361111111111111 | 0 |
| 0.8368055555555555 | 0 |
| 0.8375 | 0 |
| 0.8381944444444445 | 0 |
| 0.8388888888888889 | 0 |
| 0.8395833333333332 | 0 |
| 0.8402777777777778 | 0 |
| 0.8409722222222222 | 0 |
| 0.8416666666666667 | 0 |
| 0.842361111111111 | 0 |
| 0.8430555555555556 | 0 |
| 0.84375 | 0 |
| 0.8444444444444444 | 0 |
| 0.845138888888889 | 0 |
| 0.8458333333333333 | 0 |
| 0.8465277777777778 | 0 |
| 0.8472222222222222 | 0 |
| 0.8479166666666668 | 0 |
| 0.8486111111111111 | 0 |
| 0.8493055555555555 | 0 |
| 0.85 | 0 |
| 0.8506944444444445 | 0 |
| 0.8513888888888889 | 0 |
| 0.8520833333333333 | 0 |
| 0.8527777777777777 | 0 |
| 0.8534722222222223 | 0 |
| 0.8541666666666666 | 0 |
| 0.8548611111111111 | 0 |
| 0.8555555555555556 | 0 |
| 0.8562500000000001 | 0 |
| 0.8569444444444444 | 0 |
| 0.8576388888888888 | 0 |
| 0.8583333333333334 | 0 |
| 0.8590277777777778 | 0 |
| 0.8597222222222222 | 0 |
| 0.8604166666666666 | 0 |
| 0.8611111111111112 | 0 |
| 0.8618055555555556 | 0 |
| 0.8624999999999999 | 0 |
| 0.8631944444444444 | 0 |
| 0.8638888888888889 | 0 |
| 0.8645833333333334 | 0 |
| 0.8652777777777777 | 0 |
| 0.8659722222222223 | 0 |
| 0.8666666666666667 | 0 |
| 0.8673611111111111 | 0 |
| 0.8680555555555555 | 0 |
| 0.86875 | 0 |
| 0.8694444444444445 | 0 |
| 0.8701388888888889 | 0 |
| 0.8708333333333332 | 0 |
| 0.8715277777777778 | 0 |
| 0.8722222222222222 | 0 |
| 0.8729166666666667 | 0 |
| 0.873611111111111 | 0 |
| 0.8743055555555556 | 0 |
| 0.875 | 0 |
| 0.8756944444444444 | 0 |
| 0.876388888888889 | 0 |
| 0.8770833333333333 | 0 |
| 0.8777777777777778 | 0 |
| 0.8784722222222222 | 0 |
| 0.8791666666666668 | 0 |
| 0.8798611111111111 | 0 |
| 0.8805555555555555 | 0 |
| 0.88125 | 0 |
| 0.8819444444444445 | 0 |
| 0.8826388888888889 | 0 |
| 0.8833333333333333 | 0 |
| 0.8840277777777777 | 0 |
| 0.8847222222222223 | 0 |
| 0.8854166666666666 | 0 |
| 0.8861111111111111 | 0 |
| 0.8868055555555556 | 0 |
| 0.8875000000000001 | 0 |
| 0.8881944444444444 | 0 |
| 0.8888888888888888 | 0 |
| 0.8895833333333334 | 0 |
| 0.8902777777777778 | 0 |
| 0.8909722222222222 | 0 |
| 0.8916666666666666 | 0 |
| 0.8923611111111112 | 0 |
| 0.8930555555555556 | 0 |
| 0.8937499999999999 | 0 |
| 0.8944444444444444 | 0 |
| 0.8951388888888889 | 0 |
| 0.8958333333333334 | 0 |
| 0.8965277777777777 | 0 |
| 0.8972222222222223 | 0 |
| 0.8979166666666667 | 0 |
| 0.8986111111111111 | 0 |
| 0.8993055555555555 | 0 |
| 0.9 | 0 |
| 0.9006944444444445 | 0 |
| 0.9013888888888889 | 0 |
| 0.9020833333333332 | 0 |
| 0.9027777777777778 | 0 |
| 0.9034722222222222 | 0 |
| 0.9041666666666667 | 0 |
| 0.904861111111111 | 0 |
| 0.9055555555555556 | 0 |
| 0.90625 | 0 |
| 0.9069444444444444 | 0 |
| 0.907638888888889 | 0 |
| 0.9083333333333333 | 0 |
| 0.9090277777777778 | 0 |
| 0.9097222222222222 | 0 |
| 0.9104166666666668 | 0 |
| 0.9111111111111111 | 0 |
| 0.9118055555555555 | 0 |
| 0.9125 | 0 |
| 0.9131944444444445 | 0 |
| 0.9138888888888889 | 0 |
| 0.9145833333333333 | 0 |
| 0.9152777777777777 | 0 |
| 0.9159722222222223 | 0 |
| 0.9166666666666666 | 0 |
| 0.9173611111111111 | 0 |
| 0.9180555555555556 | 0 |
| 0.9187500000000001 | 0 |
| 0.9194444444444444 | 0 |
| 0.9201388888888888 | 0 |
| 0.9208333333333334 | 0 |
| 0.9215277777777778 | 0 |
| 0.9222222222222222 | 0 |
| 0.9229166666666666 | 0 |
| 0.9236111111111112 | 0 |
| 0.9243055555555556 | 0 |
| 0.9249999999999999 | 0 |
| 0.9256944444444444 | 0 |
| 0.9263888888888889 | 0 |
| 0.9270833333333334 | 0 |
| 0.9277777777777777 | 0 |
| 0.9284722222222223 | 0 |
| 0.9291666666666667 | 0 |
| 0.9298611111111111 | 0 |
| 0.9305555555555555 | 0 |
| 0.93125 | 0 |
| 0.9319444444444445 | 0 |
| 0.9326388888888889 | 0 |
| 0.9333333333333332 | 0 |
| 0.9340277777777778 | 0 |
| 0.9347222222222222 | 0 |
| 0.9354166666666667 | 0 |
| 0.936111111111111 | 0 |
| 0.9368055555555556 | 0 |
| 0.9375 | 0 |
| 0.9381944444444444 | 0 |
| 0.938888888888889 | 0 |
| 0.9395833333333333 | 0 |
| 0.9402777777777778 | 0 |
| 0.9409722222222222 | 0 |
| 0.9416666666666668 | 0 |
| 0.9423611111111111 | 0 |
| 0.9430555555555555 | 0 |
| 0.94375 | 0 |
| 0.9444444444444445 | 0 |
| 0.9451388888888889 | 0 |
| 0.9458333333333333 | 0 |
| 0.9465277777777777 | 0 |
| 0.9472222222222223 | 0 |
| 0.9479166666666666 | 0 |
| 0.9486111111111111 | 0 |
| 0.9493055555555556 | 0 |
| 0.9500000000000001 | 0 |
| 0.9506944444444444 | 0 |
| 0.9513888888888888 | 0 |
| 0.9520833333333334 | 0 |
| 0.9527777777777778 | 0 |
| 0.9534722222222222 | 0 |
| 0.9541666666666666 | 0 |
| 0.9548611111111112 | 0 |
| 0.9555555555555556 | 0 |
| 0.9562499999999999 | 0 |
| 0.9569444444444444 | 0 |
| 0.9576388888888889 | 0 |
| 0.9583333333333334 | 0 |
| 0.9590277777777777 | 0 |
| 0.9597222222222223 | 0 |
| 0.9604166666666667 | 0 |
| 0.9611111111111111 | 0 |
| 0.9618055555555555 | 0 |
| 0.9625 | 0 |
| 0.9631944444444445 | 0 |
| 0.9638888888888889 | 0 |
| 0.9645833333333332 | 0 |
| 0.9652777777777778 | 0 |
| 0.9659722222222222 | 0 |
| 0.9666666666666667 | 0 |
| 0.967361111111111 | 0 |
| 0.9680555555555556 | 0 |
| 0.96875 | 0 |
| 0.9694444444444444 | 0 |
| 0.970138888888889 | 0 |
| 0.9708333333333333 | 0 |
| 0.9715277777777778 | 0 |
| 0.9722222222222222 | 0 |
| 0.9729166666666668 | 0 |
| 0.9736111111111111 | 0 |
| 0.9743055555555555 | 0 |
| 0.975 | 0 |
| 0.9756944444444445 | 0 |
| 0.9763888888888889 | 0 |
| 0.9770833333333333 | 0 |
| 0.9777777777777777 | 0 |
| 0.9784722222222223 | 0 |
| 0.9791666666666666 | 0 |
| 0.9798611111111111 | 0 |
| 0.9805555555555556 | 0 |
| 0.9812500000000001 | 0 |
| 0.9819444444444444 | 0 |
| 0.9826388888888888 | 0 |
| 0.9833333333333334 | 0 |
| 0.9840277777777778 | 0 |
| 0.9847222222222222 | 0 |
| 0.9854166666666666 | 0 |
| 0.9861111111111112 | 0 |
| 0.9868055555555556 | 0 |
| 0.9874999999999999 | 0 |
| 0.9881944444444444 | 0 |
| 0.9888888888888889 | 0 |
| 0.9895833333333334 | 0 |
| 0.9902777777777777 | 0 |
| 0.9909722222222223 | 0 |
| 0.9916666666666667 | 0 |
| 0.9923611111111111 | 0 |
| 0.9930555555555555 | 0 |
| 0.99375 | 0 |
| 0.9944444444444445 | 0 |
| 0.9951388888888889 | 0 |
| 0.9958333333333332 | 0 |
| 0.9965277777777778 | 0 |
| 0.9972222222222222 | 0 |
| 0.9979166666666667 | 0 |
| 0.998611111111111 | 0 |
| 0.9993055555555556 | 0 |